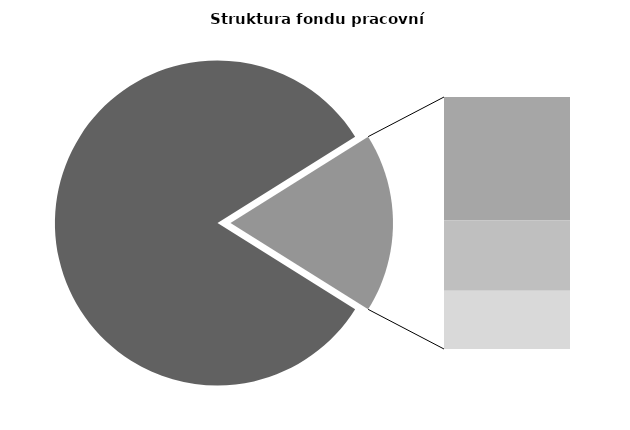
| Category | Series 0 |
|---|---|
| Průměrná měsíční odpracovaná doba bez přesčasu | 138.254 |
| Dovolená | 14.687 |
| Nemoc | 8.401 |
| Jiné | 6.922 |